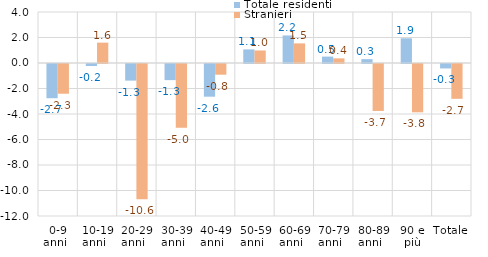
| Category | Totale residenti | Stranieri |
|---|---|---|
| 0-9 anni   | -2.684 | -2.332 |
| 10-19 anni   | -0.157 | 1.597 |
| 20-29 anni   | -1.303 | -10.604 |
| 30-39 anni   | -1.265 | -5.007 |
| 40-49 anni   | -2.564 | -0.838 |
| 50-59 anni   | 1.067 | 0.983 |
| 60-69 anni   | 2.16 | 1.538 |
| 70-79 anni   | 0.502 | 0.363 |
| 80-89 anni   | 0.302 | -3.683 |
| 90 e più | 1.938 | -3.791 |
| Totale   | -0.348 | -2.73 |